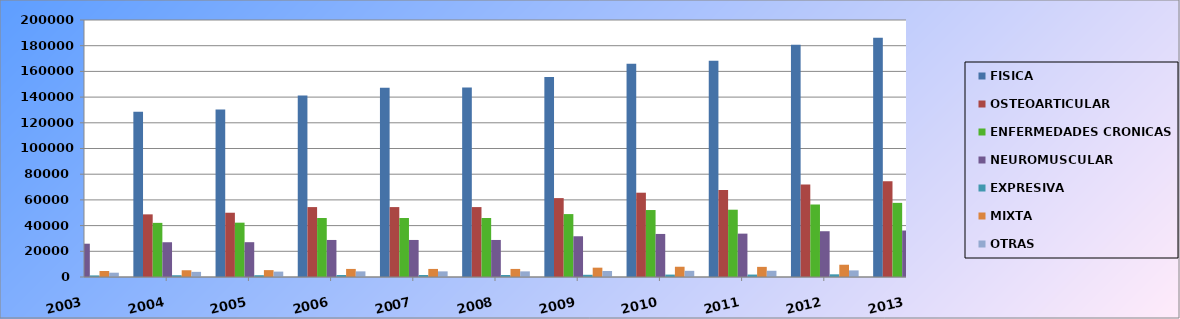
| Category | FISICA | OSTEOARTICULAR | ENFERMEDADES CRONICAS | NEUROMUSCULAR | EXPRESIVA | MIXTA | OTRAS |
|---|---|---|---|---|---|---|---|
| 2003.0 | 121780 | 46198 | 40409 | 25910 | 1240 | 4669 | 3354 |
| 2004.0 | 128562 | 48750 | 42128 | 27047 | 1381 | 5252 | 4004 |
| 2005.0 | 130356 | 50013 | 42280 | 27090 | 1409 | 5362 | 4202 |
| 2006.0 | 141329 | 54408 | 45894 | 28825 | 1536 | 6282 | 4384 |
| 2007.0 | 147205 | 54408 | 45894 | 28825 | 1536 | 6282 | 4384 |
| 2008.0 | 147526 | 54408 | 45894 | 28825 | 1536 | 6282 | 4384 |
| 2009.0 | 155724 | 61401 | 48961 | 31703 | 1724 | 7265 | 4670 |
| 2010.0 | 165883 | 65600 | 52117 | 33503 | 1876 | 7983 | 4804 |
| 2011.0 | 168375 | 67616 | 52370 | 33747 | 1903 | 7891 | 4848 |
| 2012.0 | 180765 | 71960 | 56416 | 35616 | 2089 | 9544 | 5140 |
| 2013.0 | 186237 | 74467 | 57698 | 36172 | 2160 | 10504 | 5236 |